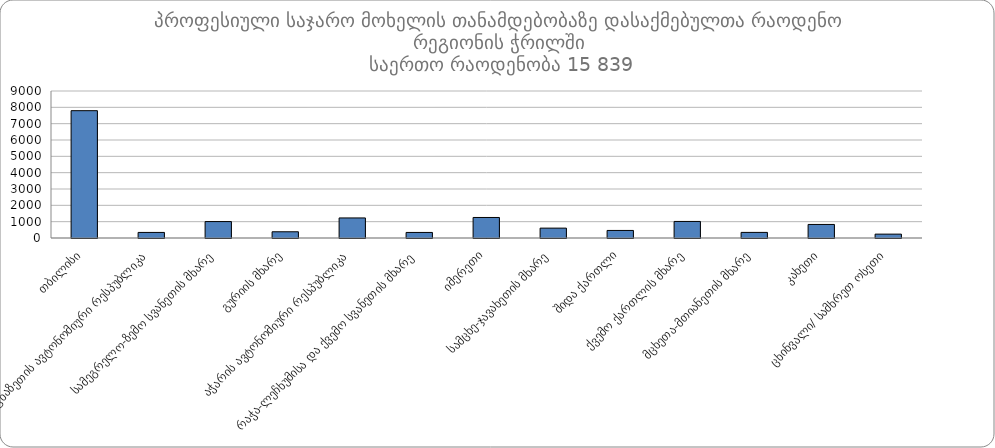
| Category | ჯამი |
|---|---|
|  თბილისი | 7795 |
|  აფხაზეთის ავტონომიური რესპუბლიკა | 341 |
|  სამეგრელო-ზემო სვანეთის მხარე | 1006 |
|  გურიის მხარე | 381 |
|  აჭარის ავტონომიური რესპუბლიკა | 1228 |
|  რაჭა-ლეჩხუმისა და ქვემო სვანეთის მხარე | 340 |
|  იმერეთი | 1257 |
|  სამცხე-ჯავახეთის მხარე | 604 |
|  შიდა ქართლი | 463 |
|  ქვემო ქართლის მხარე | 1014 |
|  მცხეთა-მთიანეთის მხარე | 343 |
|  კახეთი | 830 |
|  ცხინვალი/ სამხრეთ ოსეთი | 237 |